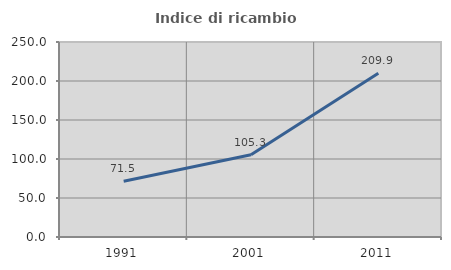
| Category | Indice di ricambio occupazionale  |
|---|---|
| 1991.0 | 71.507 |
| 2001.0 | 105.338 |
| 2011.0 | 209.917 |